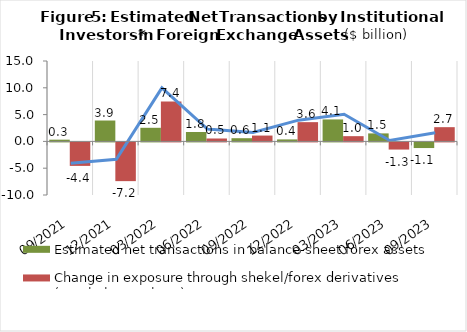
| Category | Estimated net transactions in balance-sheet forex assets | Change in exposure through shekel/forex derivatives (non-balance-sheet) |
|---|---|---|
| 2021-09-30 | 0.322 | -4.383 |
| 2021-12-31 | 3.897 | -7.228 |
| 2022-03-31 | 2.537 | 7.444 |
| 2022-06-30 | 1.751 | 0.543 |
| 2022-09-30 | 0.595 | 1.089 |
| 2022-12-31 | 0.369 | 3.592 |
| 2023-03-31 | 4.097 | 0.976 |
| 2023-06-30 | 1.493 | -1.335 |
| 2023-09-30 | -1.052 | 2.656 |